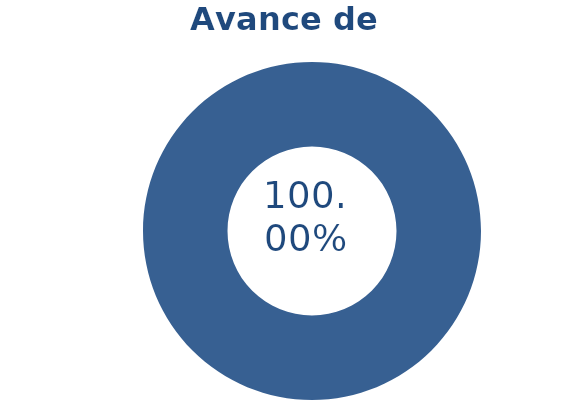
| Category | Series 0 |
|---|---|
| Acumulado 1 Trimestre | 1 |
| Año | 0 |